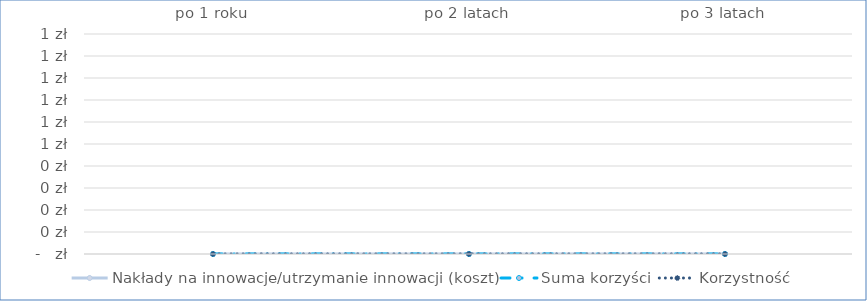
| Category | Nakłady na innowacje/utrzymanie innowacji (koszt) | Suma korzyści | Korzystność |
|---|---|---|---|
| po 1 roku | 0 | 0 | 0 |
| po 2 latach | 0 | 0 | 0 |
| po 3 latach | 0 | 0 | 0 |